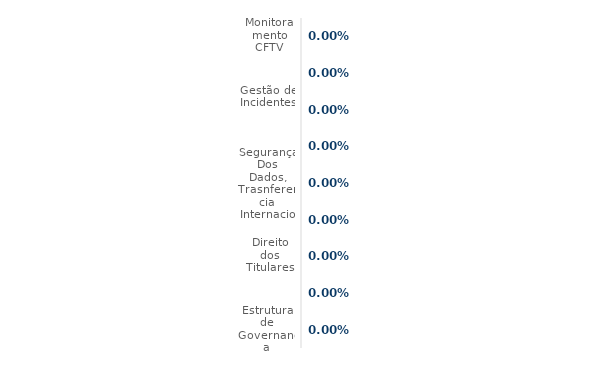
| Category | FEITO |
|---|---|
| Estrutura de Governança | 0 |
| Políticas e Normas | 0 |
| Direito dos Titulares | 0 |
| Gestão de Consentimento e Transparência | 0 |
| Segurança Dos Dados, Trasnferencia Internacional e Violações | 0 |
| Gestão de Terceiros | 0 |
| Gestão de Incidentes | 0 |
| Treinamento e Conscientização | 0 |
| Monitoramento CFTV | 0 |